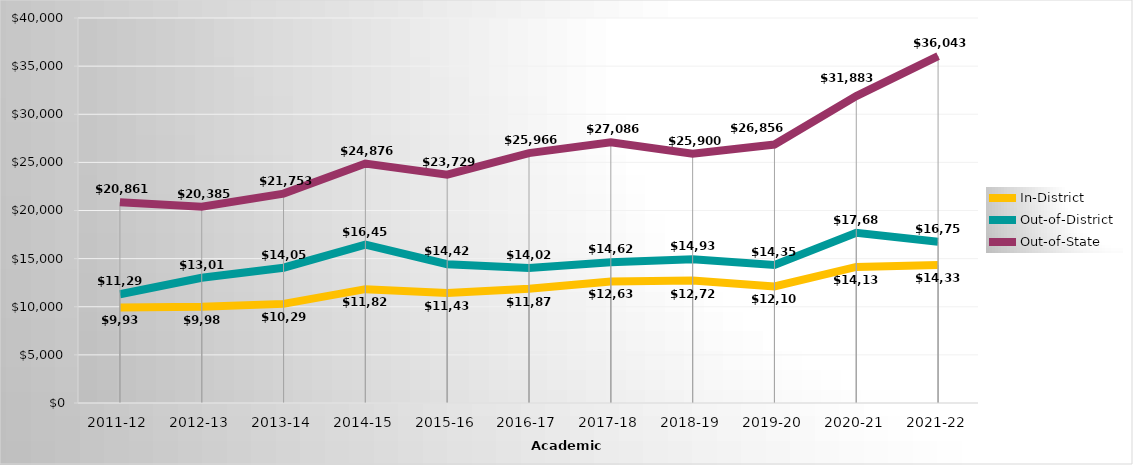
| Category | In-District | Out-of-District | Out-of-State |
|---|---|---|---|
| 2011-12 | 9933.23 | 11297.18 | 20861.23 |
| 2012-13 | 9988.67 | 13011.78 | 20384.67 |
| 2013-14 | 10297.84 | 14057.56 | 21753.28 |
| 2014-15 | 11827.062 | 16453.562 | 24875.688 |
| 2015-16 | 11438 | 14422 | 23729 |
| 2016-17 | 11878 | 14022 | 25966 |
| 2017-18 | 12630 | 14628 | 27086 |
| 2018-19 | 12724 | 14934 | 25900 |
| 2019-20 | 12106 | 14351 | 26856 |
| 2020-21 | 14133 | 17688 | 31883 |
| 2021-22 | 14332 | 16757 | 36043 |